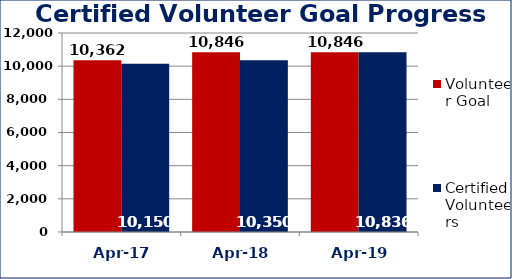
| Category | Volunteer Goal  | Certified Volunteers  |
|---|---|---|
| Apr-17 | 10362 | 10150 |
| Apr-18 | 10846 | 10350 |
| Apr-19 | 10846 | 10836 |